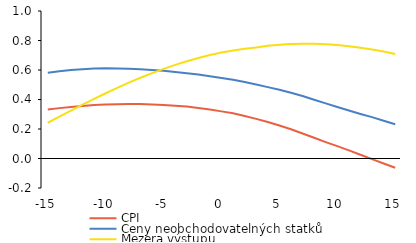
| Category | CPI | Ceny neobchodovatelných statků | Mezera výstupu |
|---|---|---|---|
| -15.0 | 0.332 | 0.581 | 0.242 |
| -14.0 | 0.342 | 0.591 | 0.284 |
| -13.0 | 0.35 | 0.6 | 0.325 |
| -12.0 | 0.356 | 0.605 | 0.365 |
| -11.0 | 0.362 | 0.61 | 0.404 |
| -10.0 | 0.366 | 0.612 | 0.442 |
| -9.0 | 0.368 | 0.611 | 0.479 |
| -8.0 | 0.369 | 0.609 | 0.514 |
| -7.0 | 0.369 | 0.605 | 0.547 |
| -6.0 | 0.367 | 0.6 | 0.579 |
| -5.0 | 0.363 | 0.594 | 0.608 |
| -4.0 | 0.358 | 0.586 | 0.635 |
| -3.0 | 0.352 | 0.578 | 0.659 |
| -2.0 | 0.343 | 0.569 | 0.681 |
| -1.0 | 0.332 | 0.558 | 0.701 |
| 0.0 | 0.32 | 0.546 | 0.718 |
| 1.0 | 0.306 | 0.534 | 0.732 |
| 2.0 | 0.289 | 0.519 | 0.744 |
| 3.0 | 0.269 | 0.502 | 0.753 |
| 4.0 | 0.248 | 0.484 | 0.764 |
| 5.0 | 0.224 | 0.465 | 0.771 |
| 6.0 | 0.198 | 0.445 | 0.776 |
| 7.0 | 0.169 | 0.423 | 0.778 |
| 8.0 | 0.141 | 0.399 | 0.778 |
| 9.0 | 0.111 | 0.373 | 0.774 |
| 10.0 | 0.084 | 0.35 | 0.769 |
| 11.0 | 0.055 | 0.325 | 0.761 |
| 12.0 | 0.026 | 0.302 | 0.751 |
| 13.0 | -0.004 | 0.281 | 0.739 |
| 14.0 | -0.034 | 0.256 | 0.725 |
| 15.0 | -0.062 | 0.233 | 0.709 |